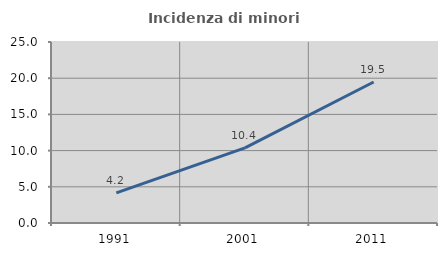
| Category | Incidenza di minori stranieri |
|---|---|
| 1991.0 | 4.167 |
| 2001.0 | 10.377 |
| 2011.0 | 19.481 |